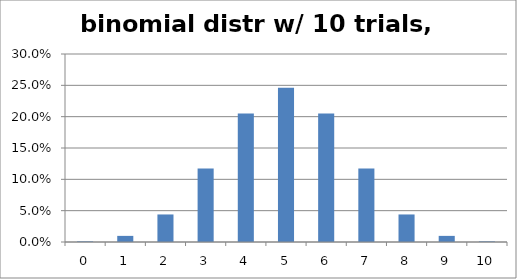
| Category | 0.5 |
|---|---|
| 0.0 | 0.001 |
| 1.0 | 0.01 |
| 2.0 | 0.044 |
| 3.0 | 0.117 |
| 4.0 | 0.205 |
| 5.0 | 0.246 |
| 6.0 | 0.205 |
| 7.0 | 0.117 |
| 8.0 | 0.044 |
| 9.0 | 0.01 |
| 10.0 | 0.001 |